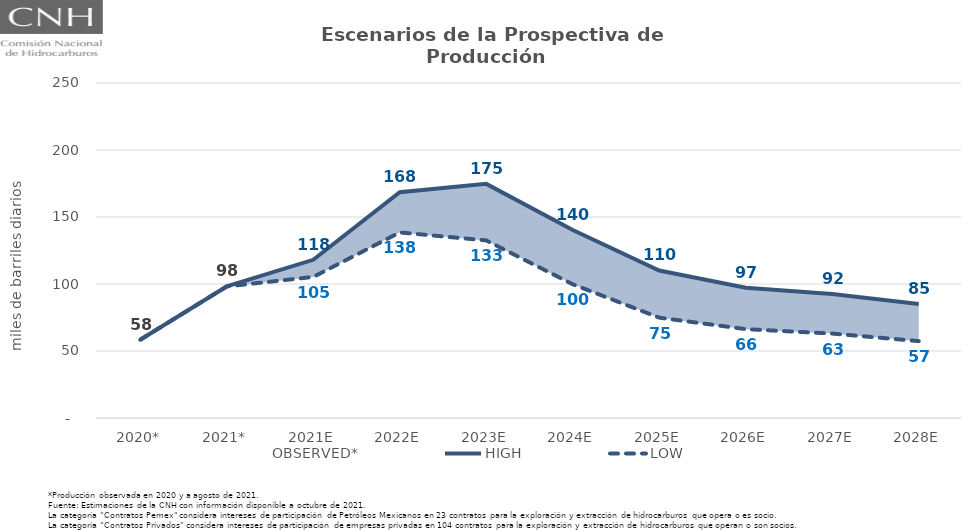
| Category | OBSERVED* | HIGH | LOW |
|---|---|---|---|
| 2020* | 58.422 | 58.422 | 58.422 |
| 2021* | 98.178 | 98.178 | 98.178 |
| 2021E | 118.061 | 118.061 | 105.272 |
| 2022E | 168.483 | 168.483 | 138.49 |
| 2023E | 174.714 | 174.714 | 132.523 |
| 2024E | 140.316 | 140.316 | 99.791 |
| 2025E | 110.091 | 110.091 | 74.884 |
| 2026E | 97.226 | 97.226 | 66.319 |
| 2027E | 92.455 | 92.455 | 63.017 |
| 2028E | 85.132 | 85.132 | 57.388 |